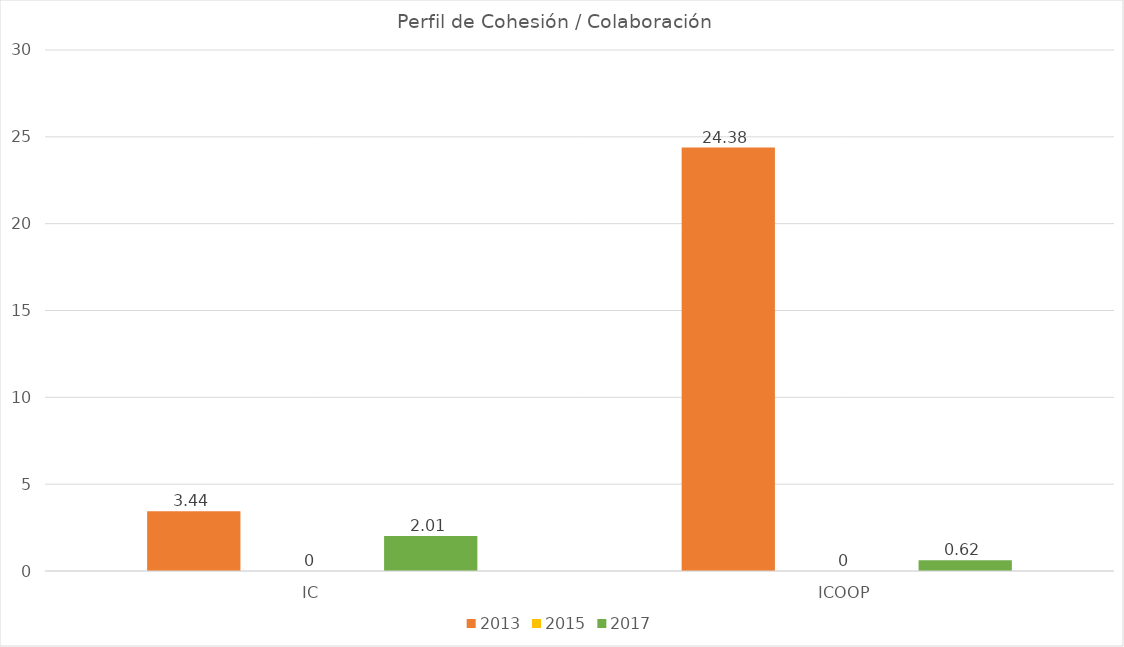
| Category | 2013 | 2015 | 2017 |
|---|---|---|---|
| IC | 3.44 | 0 | 2.01 |
| ICOOP | 24.38 | 0 | 0.62 |